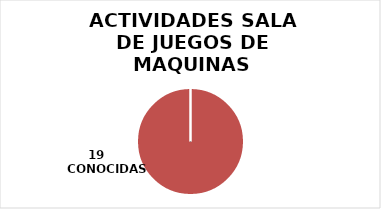
| Category | Series 0 |
|---|---|
| 0 | 0 |
| 1 | 19 |